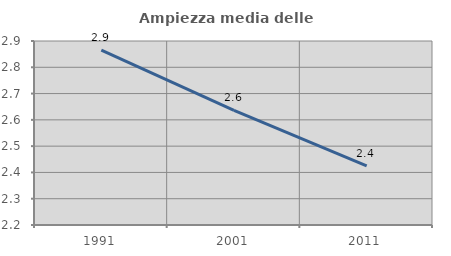
| Category | Ampiezza media delle famiglie |
|---|---|
| 1991.0 | 2.866 |
| 2001.0 | 2.636 |
| 2011.0 | 2.425 |